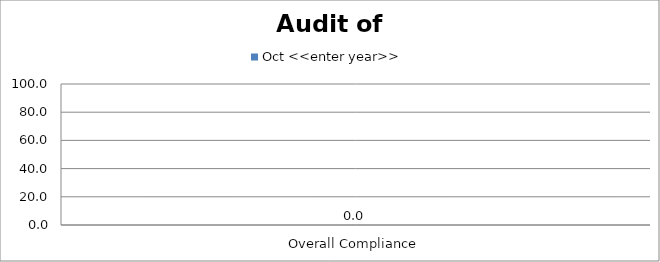
| Category | Oct <<enter year>> |
|---|---|
| Overall Compliance | 0 |